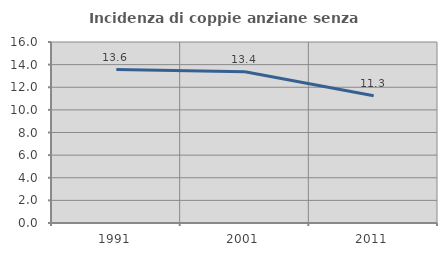
| Category | Incidenza di coppie anziane senza figli  |
|---|---|
| 1991.0 | 13.567 |
| 2001.0 | 13.371 |
| 2011.0 | 11.251 |